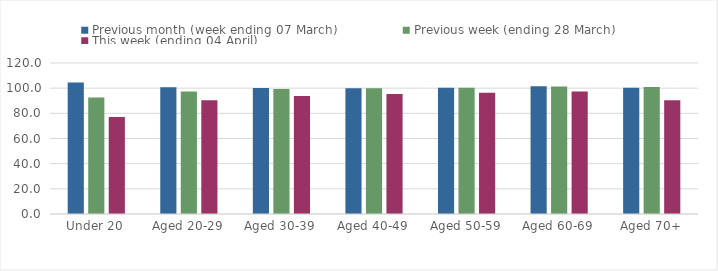
| Category | Previous month (week ending 07 March) | Previous week (ending 28 March) | This week (ending 04 April) |
|---|---|---|---|
| Under 20 | 104.536 | 92.559 | 77.099 |
| Aged 20-29 | 100.706 | 97.391 | 90.325 |
| Aged 30-39 | 100.039 | 99.308 | 93.727 |
| Aged 40-49 | 99.838 | 100 | 95.284 |
| Aged 50-59 | 100.413 | 100.277 | 96.438 |
| Aged 60-69 | 101.428 | 101.344 | 97.396 |
| Aged 70+ | 100.293 | 100.879 | 90.403 |